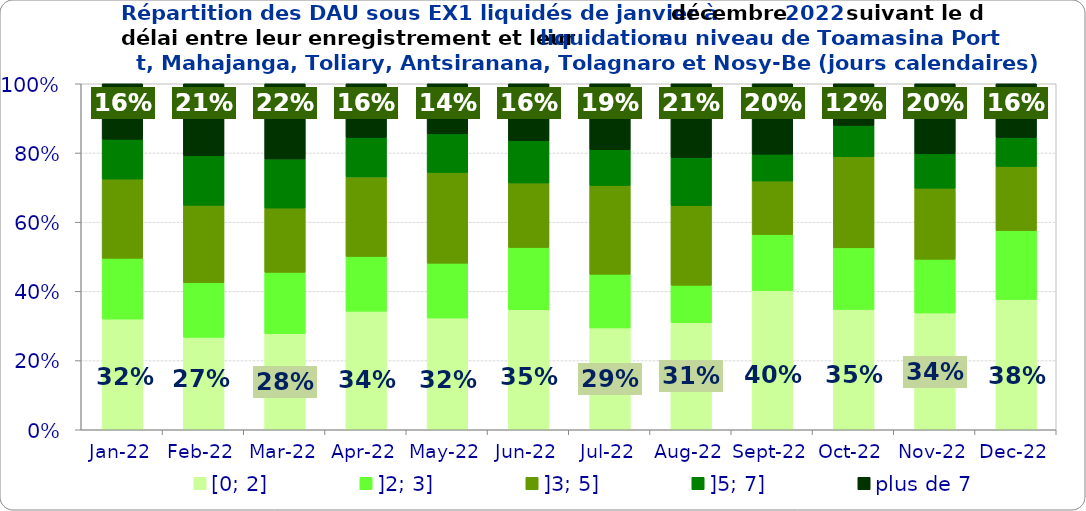
| Category | [0; 2] | ]2; 3] | ]3; 5] | ]5; 7] | plus de 7 |
|---|---|---|---|---|---|
| 2022-01-01 | 0.32 | 0.176 | 0.229 | 0.115 | 0.161 |
| 2022-02-01 | 0.267 | 0.158 | 0.223 | 0.143 | 0.208 |
| 2022-03-01 | 0.278 | 0.177 | 0.186 | 0.142 | 0.217 |
| 2022-04-01 | 0.343 | 0.158 | 0.23 | 0.114 | 0.155 |
| 2022-05-01 | 0.323 | 0.158 | 0.262 | 0.111 | 0.145 |
| 2022-06-01 | 0.347 | 0.18 | 0.186 | 0.122 | 0.165 |
| 2022-07-01 | 0.294 | 0.155 | 0.256 | 0.103 | 0.191 |
| 2022-08-01 | 0.309 | 0.108 | 0.23 | 0.139 | 0.213 |
| 2022-09-01 | 0.403 | 0.162 | 0.154 | 0.078 | 0.204 |
| 2022-10-01 | 0.348 | 0.178 | 0.263 | 0.09 | 0.121 |
| 2022-11-01 | 0.338 | 0.155 | 0.205 | 0.1 | 0.202 |
| 2022-12-01 | 0.377 | 0.199 | 0.185 | 0.084 | 0.156 |